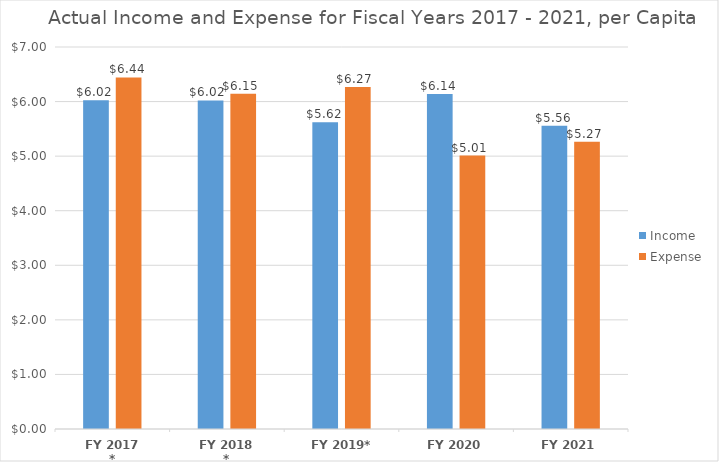
| Category | Income | Expense |
|---|---|---|
| FY 2017 * | 6.023 | 6.441 |
| FY 2018 * | 6.021 | 6.146 |
| FY 2019* | 5.623 | 6.265 |
| FY 2020 | 6.137 | 5.011 |
| FY 2021 | 5.558 | 5.266 |